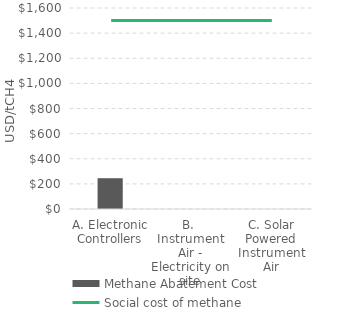
| Category | Methane Abatement Cost |
|---|---|
| A. Electronic Controllers | 245.077 |
| B.  Instrument Air - Electricity on site | 0 |
| C. Solar Powered Instrument Air | 0 |